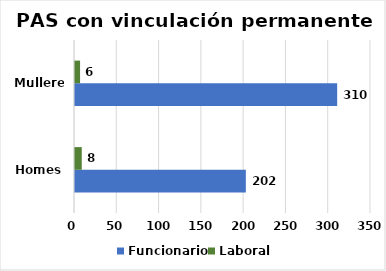
| Category | Funcionario | Laboral |
|---|---|---|
| Homes | 202 | 8 |
| Mulleres | 310 | 6 |